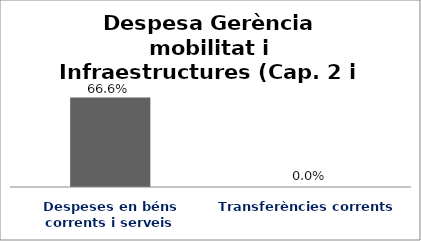
| Category | Series 0 |
|---|---|
| Despeses en béns corrents i serveis | 0.666 |
| Transferències corrents | 0 |